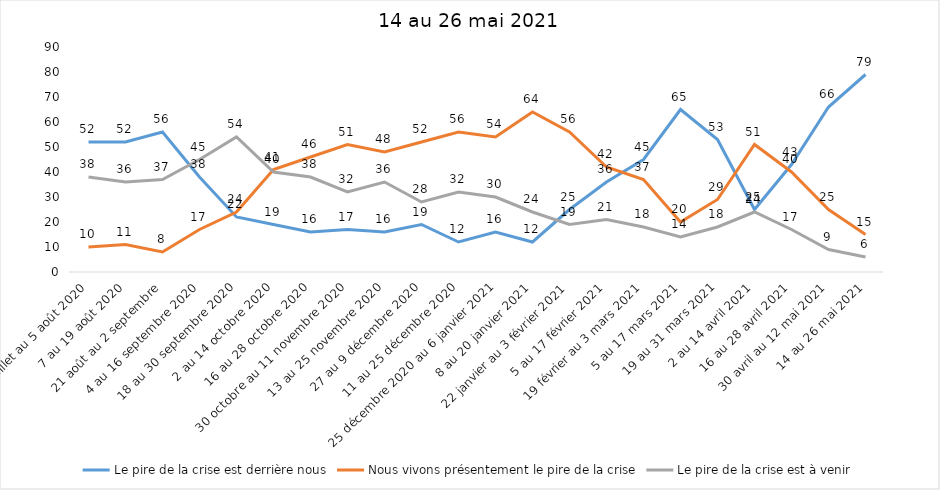
| Category | Le pire de la crise est derrière nous | Nous vivons présentement le pire de la crise | Le pire de la crise est à venir |
|---|---|---|---|
| 24 juillet au 5 août 2020 | 52 | 10 | 38 |
| 7 au 19 août 2020 | 52 | 11 | 36 |
| 21 août au 2 septembre | 56 | 8 | 37 |
| 4 au 16 septembre 2020 | 38 | 17 | 45 |
| 18 au 30 septembre 2020 | 22 | 24 | 54 |
| 2 au 14 octobre 2020 | 19 | 41 | 40 |
| 16 au 28 octobre 2020 | 16 | 46 | 38 |
| 30 octobre au 11 novembre 2020 | 17 | 51 | 32 |
| 13 au 25 novembre 2020 | 16 | 48 | 36 |
| 27 au 9 décembre 2020 | 19 | 52 | 28 |
| 11 au 25 décembre 2020 | 12 | 56 | 32 |
| 25 décembre 2020 au 6 janvier 2021 | 16 | 54 | 30 |
| 8 au 20 janvier 2021 | 12 | 64 | 24 |
| 22 janvier au 3 février 2021 | 25 | 56 | 19 |
| 5 au 17 février 2021 | 36 | 42 | 21 |
| 19 février au 3 mars 2021 | 45 | 37 | 18 |
| 5 au 17 mars 2021 | 65 | 20 | 14 |
| 19 au 31 mars 2021 | 53 | 29 | 18 |
| 2 au 14 avril 2021 | 25 | 51 | 24 |
| 16 au 28 avril 2021 | 43 | 40 | 17 |
| 30 avril au 12 mai 2021 | 66 | 25 | 9 |
| 14 au 26 mai 2021 | 79 | 15 | 6 |